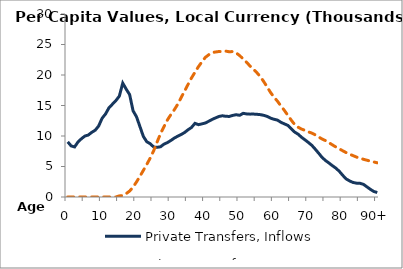
| Category | Private Transfers, Inflows | Private Transfers, Outflows |
|---|---|---|
| 0 | 9041.562 | 0 |
|  | 8375.056 | 0 |
| 2 | 8206.972 | 0 |
| 3 | 9032.658 | 0 |
| 4 | 9559.871 | 0 |
| 5 | 9991.024 | 0 |
| 6 | 10165.3 | 0 |
| 7 | 10608.65 | 0 |
| 8 | 10949.73 | 0 |
| 9 | 11647.49 | 0 |
| 10 | 12912.28 | 0 |
| 11 | 13615.6 | 0 |
| 12 | 14631.22 | 0 |
| 13 | 15214.84 | 0 |
| 14 | 15801.8 | 0 |
| 15 | 16530.18 | 181.239 |
| 16 | 18668.55 | 236.192 |
| 17 | 17684.06 | 558.019 |
| 18 | 16789.88 | 973.46 |
| 19 | 14132.25 | 1615.251 |
| 20 | 13148.68 | 2473.238 |
| 21 | 11537.21 | 3400.792 |
| 22 | 9910.496 | 4375.284 |
| 23 | 9053.261 | 5352.035 |
| 24 | 8729.831 | 6406.447 |
| 25 | 8192.671 | 7597.864 |
| 26 | 8139.106 | 9031.48 |
| 27 | 8239.17 | 10409.29 |
| 28 | 8672.592 | 11550.01 |
| 29 | 8921.586 | 12645.83 |
| 30 | 9273.867 | 13521.12 |
| 31 | 9659.563 | 14305.52 |
| 32 | 9973.791 | 15227.95 |
| 33 | 10251.46 | 16328.41 |
| 34 | 10585.32 | 17380.49 |
| 35 | 11029.94 | 18474.86 |
| 36 | 11407.71 | 19529.46 |
| 37 | 12076.21 | 20464.08 |
| 38 | 11859.25 | 21361.14 |
| 39 | 11984.79 | 22134.86 |
| 40 | 12131.3 | 22877.56 |
| 41 | 12415.66 | 23324.66 |
| 42 | 12721.76 | 23685.62 |
| 43 | 12974.03 | 23775.05 |
| 44 | 13207.13 | 23854.66 |
| 45 | 13317.37 | 23831.44 |
| 46 | 13221.04 | 23910.36 |
| 47 | 13213.29 | 23805.01 |
| 48 | 13381.63 | 23850.46 |
| 49 | 13490.74 | 23606.74 |
| 50 | 13392.65 | 23183.58 |
| 51 | 13715.38 | 22624.08 |
| 52 | 13617.65 | 22092.46 |
| 53 | 13583.71 | 21468.1 |
| 54 | 13595.49 | 20948.63 |
| 55 | 13555.68 | 20375.37 |
| 56 | 13501.25 | 19730.56 |
| 57 | 13387.84 | 18910.45 |
| 58 | 13211.6 | 18017.2 |
| 59 | 12921.74 | 17113.14 |
| 60 | 12739.67 | 16347.72 |
| 61 | 12598.87 | 15690.23 |
| 62 | 12241.73 | 14913.02 |
| 63 | 11987.39 | 14188.06 |
| 64 | 11737.42 | 13376.08 |
| 65 | 11189.26 | 12591.92 |
| 66 | 10638.15 | 11866.75 |
| 67 | 10289.62 | 11433.71 |
| 68 | 9776.61 | 11128.67 |
| 69 | 9357.956 | 10927.03 |
| 70 | 8923.982 | 10674.82 |
| 71 | 8449.876 | 10464.7 |
| 72 | 7819.87 | 10174.34 |
| 73 | 7149.228 | 9823.76 |
| 74 | 6457.969 | 9492.969 |
| 75 | 5963.141 | 9231.524 |
| 76 | 5546.138 | 8890.447 |
| 77 | 5112.352 | 8526.755 |
| 78 | 4713.124 | 8187.083 |
| 79 | 4185.319 | 7882.976 |
| 80 | 3524.853 | 7564.915 |
| 81 | 2947.936 | 7262.068 |
| 82 | 2619.809 | 7014.837 |
| 83 | 2374.902 | 6772.425 |
| 84 | 2263.444 | 6535.227 |
| 85 | 2240.965 | 6344.349 |
| 86 | 2067.741 | 6180.905 |
| 87 | 1661.321 | 6028.099 |
| 88 | 1253.892 | 5882.026 |
| 89 | 900.924 | 5740.704 |
| 90+ | 739.917 | 5605.601 |